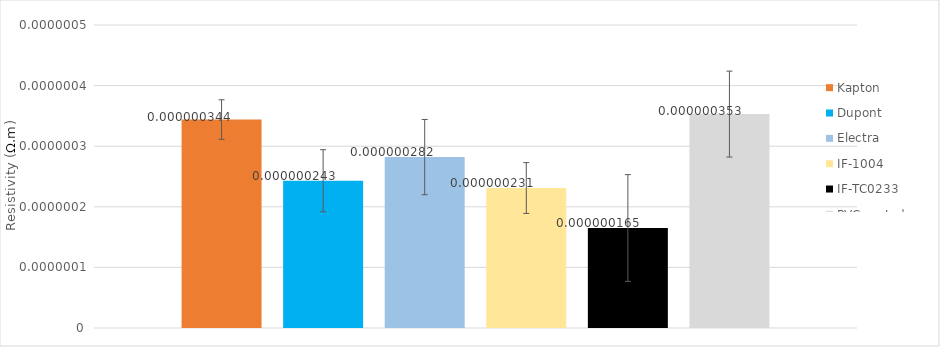
| Category | Kapton | Dupont | Electra | IF-1004 | IF-TC0233 | PVC coated fabric |
|---|---|---|---|---|---|---|
| 0 | 0 | 0 | 0 | 0 | 0 | 0 |